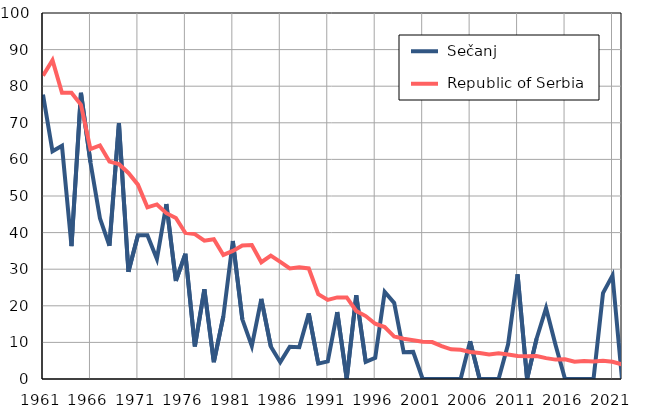
| Category |  Sečanj |  Republic of Serbia |
|---|---|---|
| 1961.0 | 77.7 | 82.9 |
| 1962.0 | 62.2 | 87.1 |
| 1963.0 | 63.7 | 78.2 |
| 1964.0 | 36.3 | 78.2 |
| 1965.0 | 78.2 | 74.9 |
| 1966.0 | 59.2 | 62.8 |
| 1967.0 | 43.9 | 63.8 |
| 1968.0 | 36.4 | 59.4 |
| 1969.0 | 69.9 | 58.7 |
| 1970.0 | 29.3 | 56.3 |
| 1971.0 | 39.3 | 53.1 |
| 1972.0 | 39.3 | 46.9 |
| 1973.0 | 32.8 | 47.7 |
| 1974.0 | 47.8 | 45.3 |
| 1975.0 | 26.8 | 44 |
| 1976.0 | 34.2 | 39.9 |
| 1977.0 | 8.9 | 39.6 |
| 1978.0 | 24.5 | 37.8 |
| 1979.0 | 4.6 | 38.2 |
| 1980.0 | 17.1 | 33.9 |
| 1981.0 | 37.7 | 35 |
| 1982.0 | 16.3 | 36.5 |
| 1983.0 | 9 | 36.6 |
| 1984.0 | 21.9 | 31.9 |
| 1985.0 | 8.9 | 33.7 |
| 1986.0 | 4.6 | 32 |
| 1987.0 | 8.8 | 30.2 |
| 1988.0 | 8.7 | 30.5 |
| 1989.0 | 17.9 | 30.2 |
| 1990.0 | 4.2 | 23.2 |
| 1991.0 | 4.8 | 21.6 |
| 1992.0 | 18.3 | 22.3 |
| 1993.0 | 0 | 22.3 |
| 1994.0 | 22.9 | 18.6 |
| 1995.0 | 4.7 | 17.2 |
| 1996.0 | 5.8 | 15.1 |
| 1997.0 | 23.8 | 14.2 |
| 1998.0 | 20.8 | 11.6 |
| 1999.0 | 7.3 | 11 |
| 2000.0 | 7.4 | 10.6 |
| 2001.0 | 0 | 10.2 |
| 2002.0 | 0 | 10.1 |
| 2003.0 | 0 | 9 |
| 2004.0 | 0 | 8.1 |
| 2005.0 | 0 | 8 |
| 2006.0 | 10.3 | 7.4 |
| 2007.0 | 0 | 7.1 |
| 2008.0 | 0 | 6.7 |
| 2009.0 | 0 | 7 |
| 2010.0 | 9.5 | 6.7 |
| 2011.0 | 28.6 | 6.3 |
| 2012.0 | 0 | 6.2 |
| 2013.0 | 11 | 6.3 |
| 2014.0 | 19.4 | 5.7 |
| 2015.0 | 9.3 | 5.3 |
| 2016.0 | 0 | 5.4 |
| 2017.0 | 0 | 4.7 |
| 2018.0 | 0 | 4.9 |
| 2019.0 | 0 | 4.8 |
| 2020.0 | 23.5 | 5 |
| 2021.0 | 28.3 | 4.7 |
| 2022.0 | 0 | 4 |